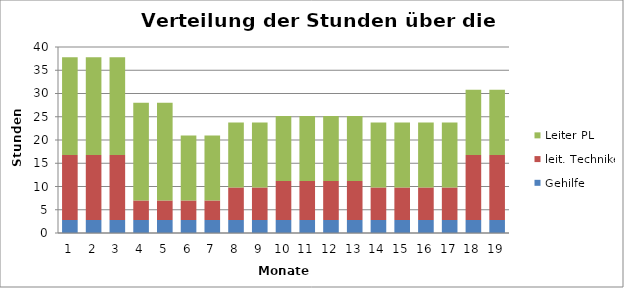
| Category | Gehilfe | leit. Techniker | Leiter PL |
|---|---|---|---|
| 0 | 2.798 | 13.992 | 20.989 |
| 1 | 2.798 | 13.992 | 20.989 |
| 2 | 2.798 | 13.992 | 20.989 |
| 3 | 2.798 | 4.198 | 20.989 |
| 4 | 2.798 | 4.198 | 20.989 |
| 5 | 2.798 | 4.198 | 13.992 |
| 6 | 2.798 | 4.198 | 13.992 |
| 7 | 2.798 | 6.996 | 13.992 |
| 8 | 2.798 | 6.996 | 13.992 |
| 9 | 2.798 | 8.395 | 13.992 |
| 10 | 2.798 | 8.395 | 13.992 |
| 11 | 2.798 | 8.395 | 13.992 |
| 12 | 2.798 | 8.395 | 13.992 |
| 13 | 2.798 | 6.996 | 13.992 |
| 14 | 2.798 | 6.996 | 13.992 |
| 15 | 2.798 | 6.996 | 13.992 |
| 16 | 2.798 | 6.996 | 13.992 |
| 17 | 2.798 | 13.992 | 13.992 |
| 18 | 2.798 | 13.992 | 13.992 |